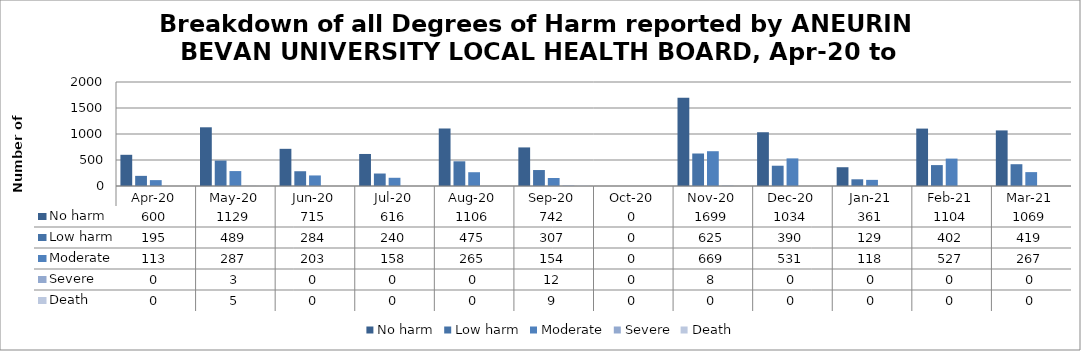
| Category | No harm | Low harm | Moderate | Severe | Death |
|---|---|---|---|---|---|
| Apr-20 | 600 | 195 | 113 | 0 | 0 |
| May-20 | 1129 | 489 | 287 | 3 | 5 |
| Jun-20 | 715 | 284 | 203 | 0 | 0 |
| Jul-20 | 616 | 240 | 158 | 0 | 0 |
| Aug-20 | 1106 | 475 | 265 | 0 | 0 |
| Sep-20 | 742 | 307 | 154 | 12 | 9 |
| Oct-20 | 0 | 0 | 0 | 0 | 0 |
| Nov-20 | 1699 | 625 | 669 | 8 | 0 |
| Dec-20 | 1034 | 390 | 531 | 0 | 0 |
| Jan-21 | 361 | 129 | 118 | 0 | 0 |
| Feb-21 | 1104 | 402 | 527 | 0 | 0 |
| Mar-21 | 1069 | 419 | 267 | 0 | 0 |